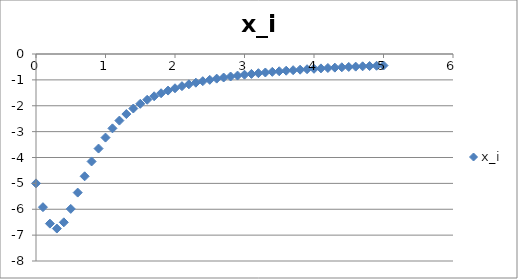
| Category | x_i |
|---|---|
| 0.0 | -5 |
| 0.1 | -5.92 |
| 0.2 | -6.556 |
| 0.30000000000000004 | -6.746 |
| 0.4 | -6.505 |
| 0.5 | -5.986 |
| 0.6 | -5.356 |
| 0.7 | -4.727 |
| 0.7999999999999999 | -4.153 |
| 0.8999999999999999 | -3.654 |
| 0.9999999999999999 | -3.231 |
| 1.0999999999999999 | -2.874 |
| 1.2 | -2.574 |
| 1.3 | -2.321 |
| 1.4000000000000001 | -2.107 |
| 1.5000000000000002 | -1.925 |
| 1.6000000000000003 | -1.769 |
| 1.7000000000000004 | -1.634 |
| 1.8000000000000005 | -1.517 |
| 1.9000000000000006 | -1.414 |
| 2.0000000000000004 | -1.324 |
| 2.1000000000000005 | -1.244 |
| 2.2000000000000006 | -1.173 |
| 2.3000000000000007 | -1.109 |
| 2.400000000000001 | -1.051 |
| 2.500000000000001 | -0.999 |
| 2.600000000000001 | -0.952 |
| 2.700000000000001 | -0.909 |
| 2.800000000000001 | -0.87 |
| 2.9000000000000012 | -0.834 |
| 3.0000000000000013 | -0.8 |
| 3.1000000000000014 | -0.77 |
| 3.2000000000000015 | -0.741 |
| 3.3000000000000016 | -0.715 |
| 3.4000000000000017 | -0.69 |
| 3.5000000000000018 | -0.667 |
| 3.600000000000002 | -0.646 |
| 3.700000000000002 | -0.625 |
| 3.800000000000002 | -0.606 |
| 3.900000000000002 | -0.589 |
| 4.000000000000002 | -0.572 |
| 4.100000000000001 | -0.556 |
| 4.200000000000001 | -0.541 |
| 4.300000000000001 | -0.527 |
| 4.4 | -0.513 |
| 4.5 | -0.5 |
| 4.6 | -0.488 |
| 4.699999999999999 | -0.476 |
| 4.799999999999999 | -0.465 |
| 4.899999999999999 | -0.455 |
| 4.999999999999998 | -0.445 |